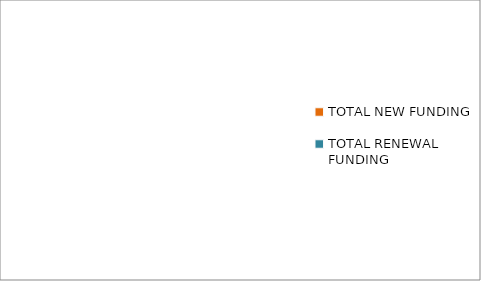
| Category | Series 0 |
|---|---|
| TOTAL NEW FUNDING | 0 |
| TOTAL RENEWAL FUNDING | 0 |